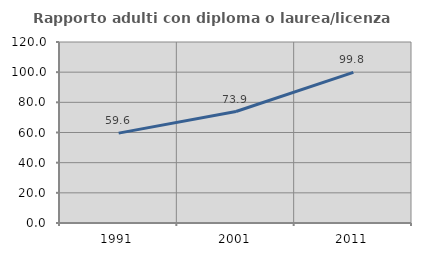
| Category | Rapporto adulti con diploma o laurea/licenza media  |
|---|---|
| 1991.0 | 59.599 |
| 2001.0 | 73.922 |
| 2011.0 | 99.814 |